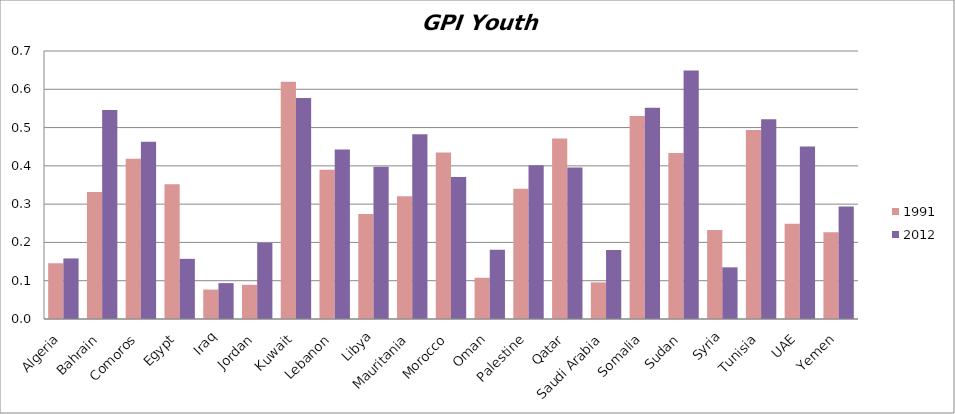
| Category | 1991 | 2012 |
|---|---|---|
| Algeria | 0.146 | 0.158 |
| Bahrain | 0.332 | 0.546 |
| Comoros | 0.419 | 0.463 |
| Egypt | 0.352 | 0.157 |
| Iraq | 0.077 | 0.094 |
| Jordan | 0.089 | 0.199 |
| Kuwait | 0.62 | 0.577 |
| Lebanon | 0.39 | 0.443 |
| Libya | 0.274 | 0.397 |
| Mauritania | 0.32 | 0.483 |
| Morocco | 0.435 | 0.371 |
| Oman | 0.108 | 0.181 |
| Palestine | 0.34 | 0.401 |
| Qatar | 0.471 | 0.396 |
| Saudi Arabia | 0.096 | 0.18 |
| Somalia | 0.53 | 0.552 |
| Sudan | 0.434 | 0.649 |
| Syria | 0.232 | 0.135 |
| Tunisia | 0.493 | 0.522 |
| UAE | 0.249 | 0.451 |
| Yemen | 0.226 | 0.294 |